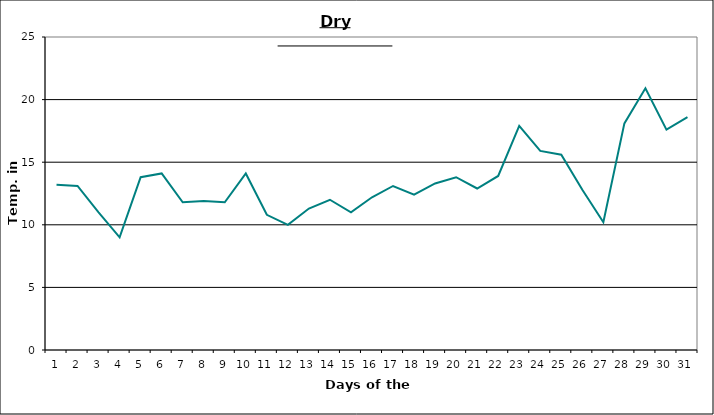
| Category | Series 0 |
|---|---|
| 0 | 13.2 |
| 1 | 13.1 |
| 2 | 11 |
| 3 | 9 |
| 4 | 13.8 |
| 5 | 14.1 |
| 6 | 11.8 |
| 7 | 11.9 |
| 8 | 11.8 |
| 9 | 14.1 |
| 10 | 10.8 |
| 11 | 10 |
| 12 | 11.3 |
| 13 | 12 |
| 14 | 11 |
| 15 | 12.2 |
| 16 | 13.1 |
| 17 | 12.4 |
| 18 | 13.3 |
| 19 | 13.8 |
| 20 | 12.9 |
| 21 | 13.9 |
| 22 | 17.9 |
| 23 | 15.9 |
| 24 | 15.6 |
| 25 | 12.8 |
| 26 | 10.2 |
| 27 | 18.1 |
| 28 | 20.9 |
| 29 | 17.6 |
| 30 | 18.6 |